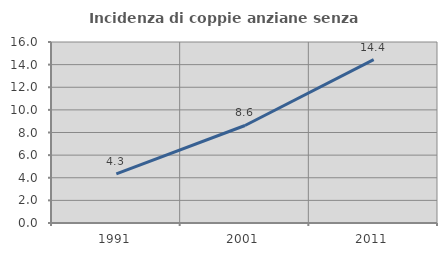
| Category | Incidenza di coppie anziane senza figli  |
|---|---|
| 1991.0 | 4.348 |
| 2001.0 | 8.621 |
| 2011.0 | 14.435 |